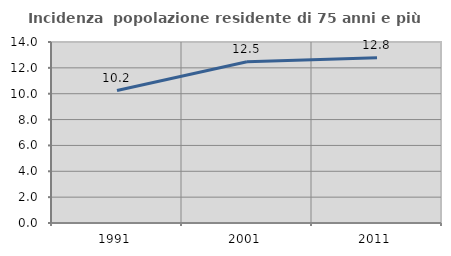
| Category | Incidenza  popolazione residente di 75 anni e più |
|---|---|
| 1991.0 | 10.243 |
| 2001.0 | 12.466 |
| 2011.0 | 12.791 |